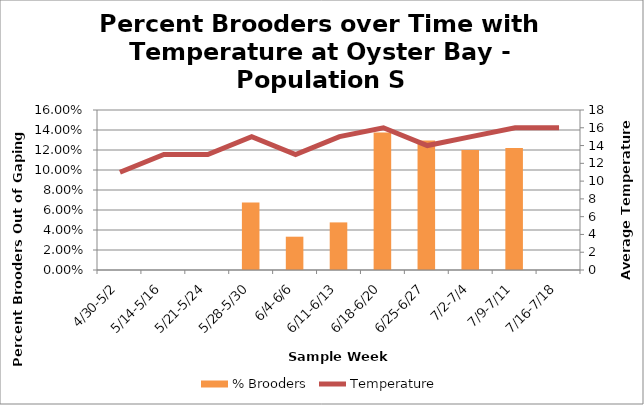
| Category | % Brooders |
|---|---|
| 4/30-5/2 | 0 |
| 5/14-5/16 | 0 |
| 5/21-5/24 | 0 |
| 5/28-5/30 | 0.068 |
| 6/4-6/6 | 0.033 |
| 6/11-6/13 | 0.048 |
| 6/18-6/20 | 0.138 |
| 6/25-6/27 | 0.129 |
| 7/2-7/4 | 0.12 |
| 7/9-7/11 | 0.122 |
| 7/16-7/18 | 0 |